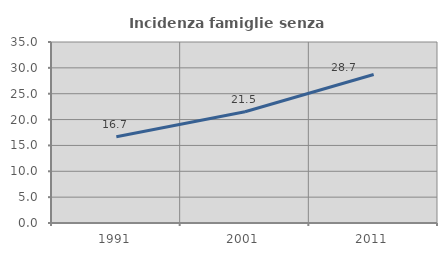
| Category | Incidenza famiglie senza nuclei |
|---|---|
| 1991.0 | 16.667 |
| 2001.0 | 21.513 |
| 2011.0 | 28.704 |